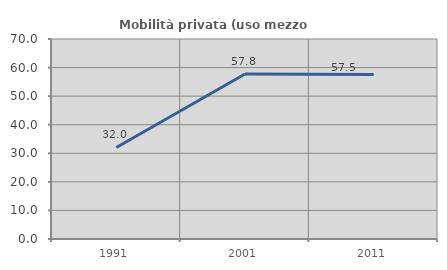
| Category | Mobilità privata (uso mezzo privato) |
|---|---|
| 1991.0 | 32.036 |
| 2001.0 | 57.77 |
| 2011.0 | 57.541 |